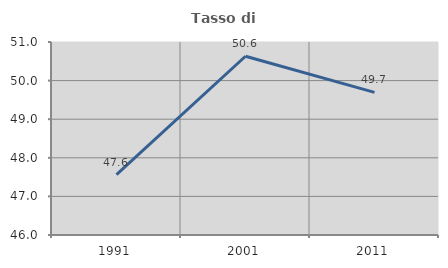
| Category | Tasso di occupazione   |
|---|---|
| 1991.0 | 47.566 |
| 2001.0 | 50.631 |
| 2011.0 | 49.694 |